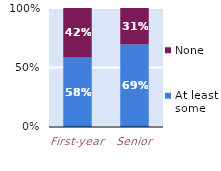
| Category | At least some | None |
|---|---|---|
| First-year | 0.584 | 0.416 |
| Senior | 0.692 | 0.308 |